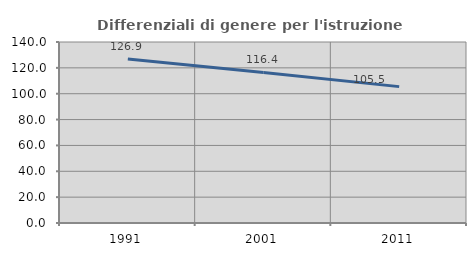
| Category | Differenziali di genere per l'istruzione superiore |
|---|---|
| 1991.0 | 126.923 |
| 2001.0 | 116.42 |
| 2011.0 | 105.482 |